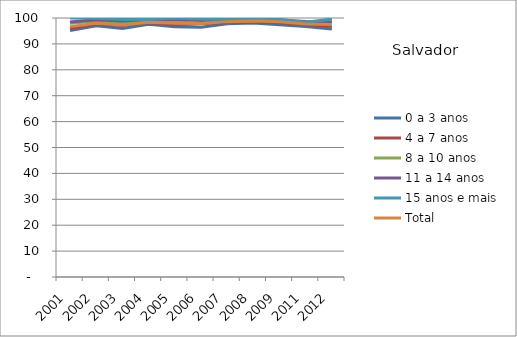
| Category | 0 a 3 anos | 4 a 7 anos | 8 a 10 anos | 11 a 14 anos | 15 anos e mais | Total |
|---|---|---|---|---|---|---|
| 2001.0 | 95.12 | 95.98 | 97.95 | 98.5 | 100 | 96.67 |
| 2002.0 | 96.96 | 97.56 | 98.75 | 99.29 | 99.86 | 98.01 |
| 2003.0 | 95.98 | 97.09 | 97.98 | 98.86 | 99.4 | 97.34 |
| 2004.0 | 97.56 | 98.22 | 98.53 | 99.44 | 99.4 | 98.4 |
| 2005.0 | 96.61 | 97.43 | 98.57 | 99.52 | 100 | 97.99 |
| 2006.0 | 96.45 | 97.81 | 97.84 | 99.05 | 99.66 | 97.85 |
| 2007.0 | 97.82 | 98.22 | 98.85 | 99.38 | 99.56 | 98.6 |
| 2008.0 | 98.05 | 98.48 | 98.96 | 99.49 | 99.79 | 98.82 |
| 2009.0 | 97.42 | 98.28 | 99.24 | 99.21 | 99.42 | 98.52 |
| 2011.0 | 96.75 | 97.36 | 97.95 | 98.61 | 98.39 | 97.73 |
| 2012.0 | 95.73 | 96.81 | 98.05 | 98.6 | 99.59 | 97.49 |